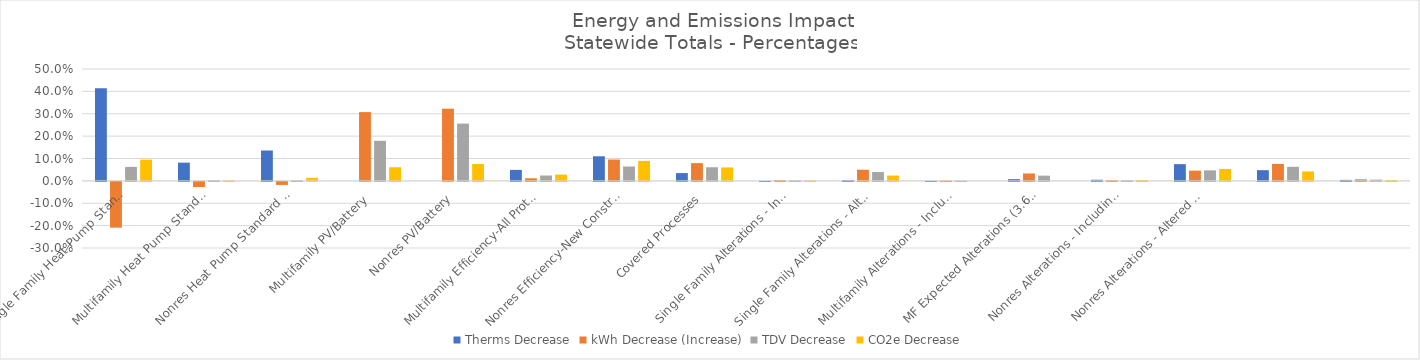
| Category | Therms Decrease | kWh Decrease (Increase) | TDV Decrease | CO2e Decrease |
|---|---|---|---|---|
| Single Family Heat Pump Standard Design | 0.414 | -0.204 | 0.063 | 0.095 |
| Multifamily Heat Pump Standard Design | 0.081 | -0.023 | 0.003 | 0.002 |
| Nonres Heat Pump Standard Design | 0.136 | -0.014 | 0.003 | 0.014 |
| Multifamily PV/Battery | 0 | 0.307 | 0.179 | 0.061 |
| Nonres PV/Battery | 0 | 0.323 | 0.256 | 0.075 |
| Multifamily Efficiency-All Prototypes | 0.049 | 0.012 | 0.024 | 0.028 |
| Nonres Efficiency-New Construction | 0.11 | 0.095 | 0.064 | 0.089 |
| Covered Processes | 0.035 | 0.079 | 0.061 | 0.06 |
|  Single Family Alterations - Including All Existing Buildings  | 0 | 0.003 | 0.003 | 0.002 |
|  Single Family Alterations - Altered Buildings Only (7% of existing buildings)  | 0.003 | 0.05 | 0.039 | 0.024 |
|  Multifamily Alterations - Including All Existing Buildings  | 0 | 0.001 | 0.001 | 0 |
|  MF Expected Alterations (3.6% of existing buildings)  | 0.008 | 0.033 | 0.023 | 0 |
|  Nonres Alterations - Including All Existing Buildings | 0.005 | 0.003 | 0.003 | 0.004 |
|  Nonres Alterations - Altered Buildings Only (7% of existing buildings)  | 0.075 | 0.046 | 0.047 | 0.053 |